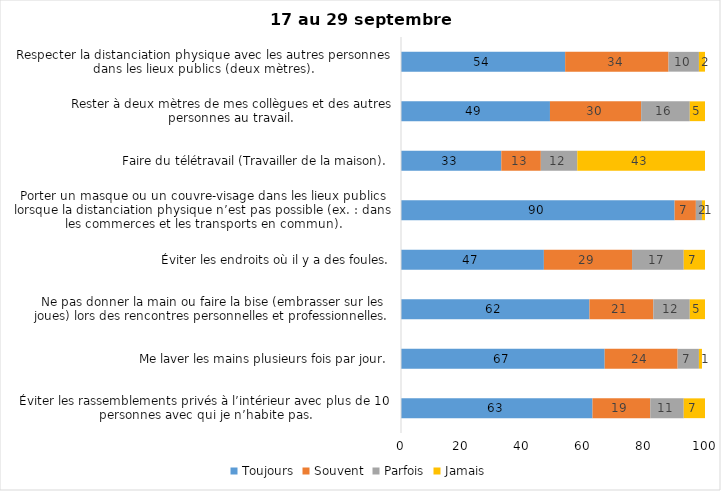
| Category | Toujours | Souvent | Parfois | Jamais |
|---|---|---|---|---|
| Éviter les rassemblements privés à l’intérieur avec plus de 10 personnes avec qui je n’habite pas. | 63 | 19 | 11 | 7 |
| Me laver les mains plusieurs fois par jour. | 67 | 24 | 7 | 1 |
| Ne pas donner la main ou faire la bise (embrasser sur les joues) lors des rencontres personnelles et professionnelles. | 62 | 21 | 12 | 5 |
| Éviter les endroits où il y a des foules. | 47 | 29 | 17 | 7 |
| Porter un masque ou un couvre-visage dans les lieux publics lorsque la distanciation physique n’est pas possible (ex. : dans les commerces et les transports en commun). | 90 | 7 | 2 | 1 |
| Faire du télétravail (Travailler de la maison). | 33 | 13 | 12 | 43 |
| Rester à deux mètres de mes collègues et des autres personnes au travail. | 49 | 30 | 16 | 5 |
| Respecter la distanciation physique avec les autres personnes dans les lieux publics (deux mètres). | 54 | 34 | 10 | 2 |